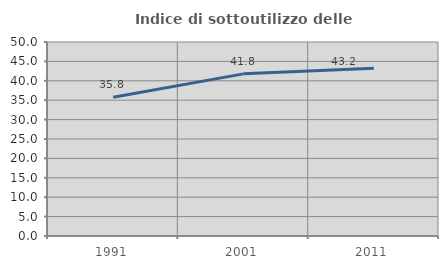
| Category | Indice di sottoutilizzo delle abitazioni  |
|---|---|
| 1991.0 | 35.784 |
| 2001.0 | 41.79 |
| 2011.0 | 43.22 |